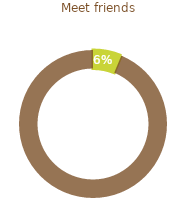
| Category | Meet friends |
|---|---|
| 0 | 0.062 |
| 1 | 0.938 |